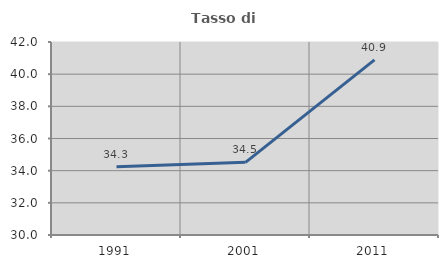
| Category | Tasso di occupazione   |
|---|---|
| 1991.0 | 34.25 |
| 2001.0 | 34.518 |
| 2011.0 | 40.884 |